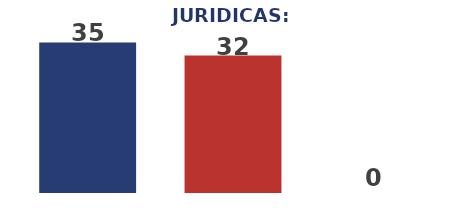
| Category | Series 0 |
|---|---|
| 0 | 35 |
| 1 | 32 |
| 2 | 0 |